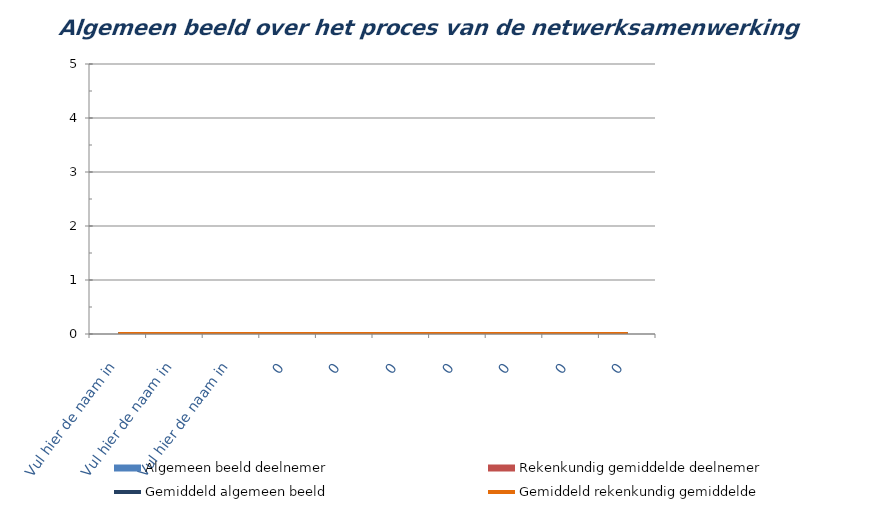
| Category | Algemeen beeld deelnemer | Rekenkundig gemiddelde deelnemer |
|---|---|---|
| Vul hier de naam in | 0 | 0 |
| Vul hier de naam in | 0 | 0 |
| Vul hier de naam in | 0 | 0 |
| 0 | 0 | 0 |
| 0 | 0 | 0 |
| 0 | 0 | 0 |
| 0 | 0 | 0 |
| 0 | 0 | 0 |
| 0 | 0 | 0 |
| 0 | 0 | 0 |